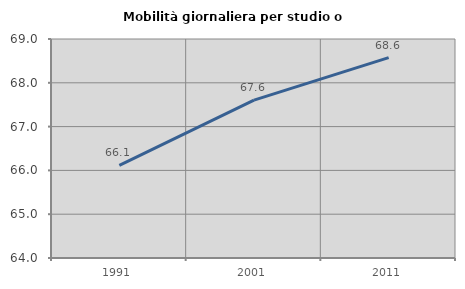
| Category | Mobilità giornaliera per studio o lavoro |
|---|---|
| 1991.0 | 66.114 |
| 2001.0 | 67.603 |
| 2011.0 | 68.574 |